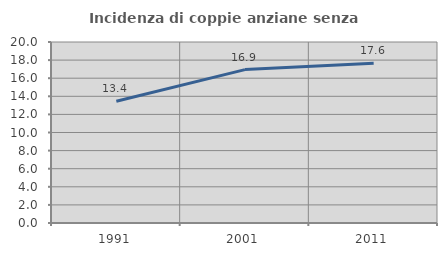
| Category | Incidenza di coppie anziane senza figli  |
|---|---|
| 1991.0 | 13.45 |
| 2001.0 | 16.949 |
| 2011.0 | 17.64 |